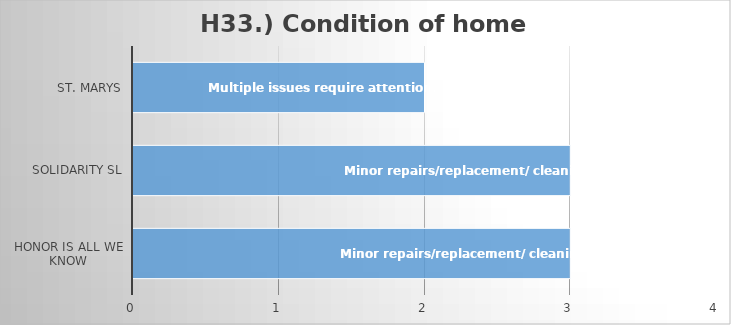
| Category | H33.) Condition of home overall? |
|---|---|
| Honor Is All We Know | 3 |
| Solidarity SL | 3 |
| St. Marys | 2 |